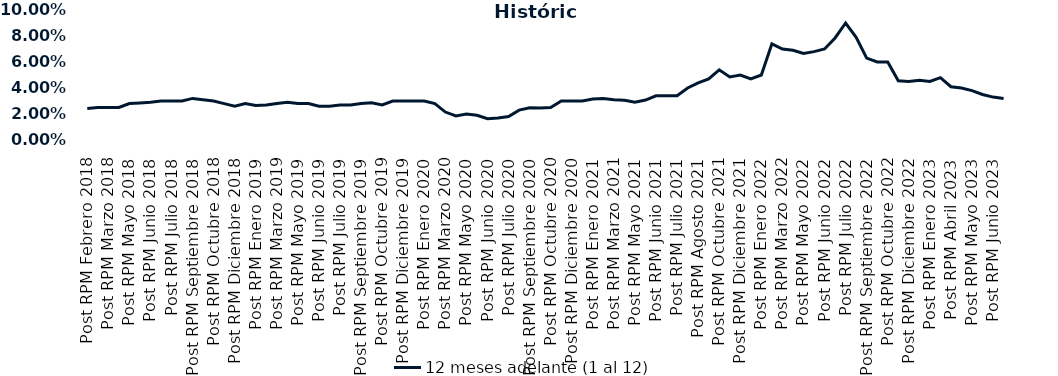
| Category | 12 meses adelante (1 al 12)  |
|---|---|
| Post RPM Febrero 2018 | 0.024 |
| Pre RPM Marzo 2018 | 0.025 |
| Post RPM Marzo 2018 | 0.025 |
| Pre RPM Mayo 2018 | 0.025 |
| Post RPM Mayo 2018 | 0.028 |
| Pre RPM Junio 2018 | 0.028 |
| Post RPM Junio 2018 | 0.029 |
| Pre RPM Julio 2018 | 0.03 |
| Post RPM Julio 2018 | 0.03 |
| Pre RPM Septiembre 2018 | 0.03 |
| Post RPM Septiembre 2018 | 0.032 |
| Pre RPM Octubre 2018 | 0.031 |
| Post RPM Octubre 2018 | 0.03 |
| Pre RPM Diciembre 2018 | 0.028 |
| Post RPM Diciembre 2018 | 0.026 |
| Pre RPM Enero 2019 | 0.028 |
| Post RPM Enero 2019 | 0.026 |
| Pre RPM Marzo 2019 | 0.027 |
| Post RPM Marzo 2019 | 0.028 |
| Pre RPM Mayo 2019 | 0.029 |
| Post RPM Mayo 2019 | 0.028 |
| Pre RPM Junio 2019 | 0.028 |
| Post RPM Junio 2019 | 0.026 |
| Pre RPM Julio 2019 | 0.026 |
| Post RPM Julio 2019 | 0.027 |
| Pre RPM Septiembre 2019 | 0.027 |
| Post RPM Septiembre 2019 | 0.028 |
| Pre RPM Octubre 2019 | 0.029 |
| Post RPM Octubre 2019 | 0.027 |
| Pre RPM Diciembre 2019 | 0.03 |
| Post RPM Diciembre 2019 | 0.03 |
| Pre RPM Enero 2020 | 0.03 |
| Post RPM Enero 2020 | 0.03 |
| Pre RPM Marzo 2020 | 0.028 |
| Post RPM Marzo 2020 | 0.022 |
| Pre RPM Mayo 2020 | 0.018 |
| Post RPM Mayo 2020 | 0.02 |
| Pre RPM Junio 2020 | 0.019 |
| Post RPM Junio 2020 | 0.016 |
| Pre RPM Julio 2020 | 0.017 |
| Post RPM Julio 2020 | 0.018 |
| Pre RPM Septiembre 2020 | 0.023 |
| Post RPM Septiembre 2020 | 0.025 |
| Pre RPM Octubre 2020 | 0.025 |
| Post RPM Octubre 2020 | 0.025 |
| Pre RPM Diciembre 2020 | 0.03 |
| Post RPM Diciembre 2020 | 0.03 |
| Pre RPM Enero 2021 | 0.03 |
| Post RPM Enero 2021 | 0.032 |
| Pre RPM Marzo 2021 | 0.032 |
| Post RPM Marzo 2021 | 0.031 |
| Pre RPM Mayo 2021 | 0.03 |
| Post RPM Mayo 2021 | 0.029 |
| Pre RPM Junio 2021 | 0.031 |
| Post RPM Junio 2021 | 0.034 |
| Pre RPM Julio 2021 | 0.034 |
| Post RPM Julio 2021 | 0.034 |
| Pre RPM Agosto 2021 | 0.04 |
| Post RPM Agosto 2021 | 0.044 |
| Pre RPM Octubre 2021 | 0.047 |
| Post RPM Octubre 2021 | 0.054 |
| Pre RPM Diciembre 2021 | 0.048 |
| Post RPM Diciembre 2021 | 0.05 |
| Pre RPM Enero 2022 | 0.047 |
| Post RPM Enero 2022 | 0.05 |
| Pre RPM Marzo 2022 | 0.074 |
| Post RPM Marzo 2022 | 0.07 |
| Pre RPM Mayo 2022 | 0.069 |
| Post RPM Mayo 2022 | 0.066 |
| Pre RPM Junio 2022 | 0.068 |
| Post RPM Junio 2022 | 0.07 |
| Pre RPM Julio 2022 | 0.078 |
| Post RPM Julio 2022 | 0.09 |
| Pre RPM Septiembre 2022 | 0.079 |
| Post RPM Septiembre 2022 | 0.063 |
| Pre RPM Octubre 2022 | 0.06 |
| Post RPM Octubre 2022 | 0.06 |
| Pre RPM Diciembre 2022 | 0.046 |
| Post RPM Diciembre 2022 | 0.045 |
| Pre RPM Enero 2023 | 0.046 |
| Post RPM Enero 2023 | 0.045 |
| Pre RPM Abril 2023 | 0.048 |
| Post RPM Abril 2023 | 0.041 |
| Pre RPM Mayo 2023 | 0.04 |
| Post RPM Mayo 2023 | 0.038 |
| Pre RPM Junio 2023 | 0.035 |
| Post RPM Junio 2023 | 0.033 |
| Pre RPM Julio 2023 | 0.032 |